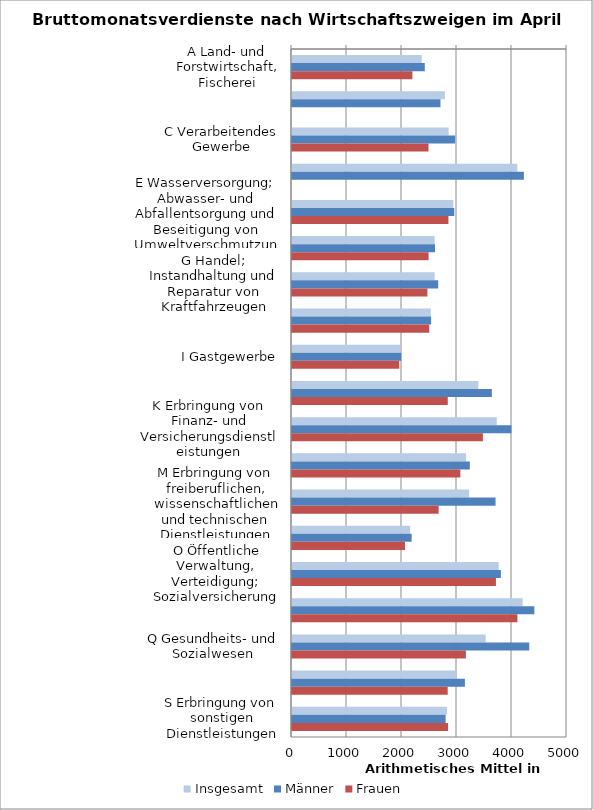
| Category | Insgesamt | Männer | Frauen |
|---|---|---|---|
| A Land- und Forstwirtschaft, Fischerei | 2359 | 2414 | 2189 |
| B Bergbau und Gewinnung von Steinen und Erden | 2780 | 2699 | 0 |
| C Verarbeitendes Gewerbe | 2849 | 2966 | 2482 |
| D Energieversorgung | 4096 | 4216 | 0 |
| E Wasserversorgung; Abwasser- und Abfallentsorgung und Beseitigung von Umweltverschmutzungen | 2933 | 2950 | 2844 |
| F Baugewerbe | 2593 | 2600 | 2483 |
| G Handel; Instandhaltung und Reparatur von Kraftfahrzeugen | 2593 | 2658 | 2462 |
| H Verkehr und Lagerei | 2523 | 2529 | 2495 |
| I Gastgewerbe | 1970 | 1986 | 1950 |
| J Information und Kommunikation | 3387 | 3634 | 2832 |
| K Erbringung von Finanz- und Versicherungsdienstleistungen | 3723 | 3990 | 3471 |
| L Grundstücks- und Wohnungswesen | 3165 | 3233 | 3061 |
| M Erbringung von freiberuflichen, wissenschaftlichen und technischen Dienstleistungen | 3221 | 3701 | 2666 |
| N Erbringung von sonstigen wirtschaftlichen Dienstleistungen | 2148 | 2175 | 2054 |
| O Öffentliche Verwaltung, Verteidigung; Sozialversicherung | 3758 | 3798 | 3708 |
| P Erziehung und Unterricht | 4194 | 4406 | 4098 |
| Q Gesundheits- und Sozialwesen | 3521 | 4313 | 3162 |
| R Kunst, Unterhaltung und Erholung | 2995 | 3144 | 2831 |
| S Erbringung von sonstigen Dienstleistungen | 2820 | 2793 | 2838 |